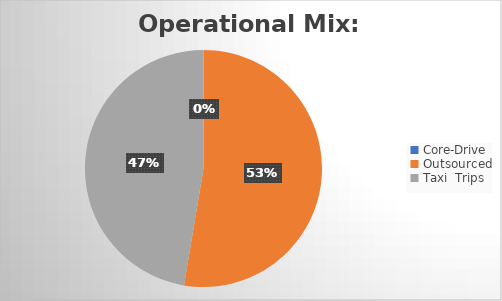
| Category | Missions |
|---|---|
| Core-Drive | 0 |
| Outsourced | 20 |
| Taxi  Trips | 18 |